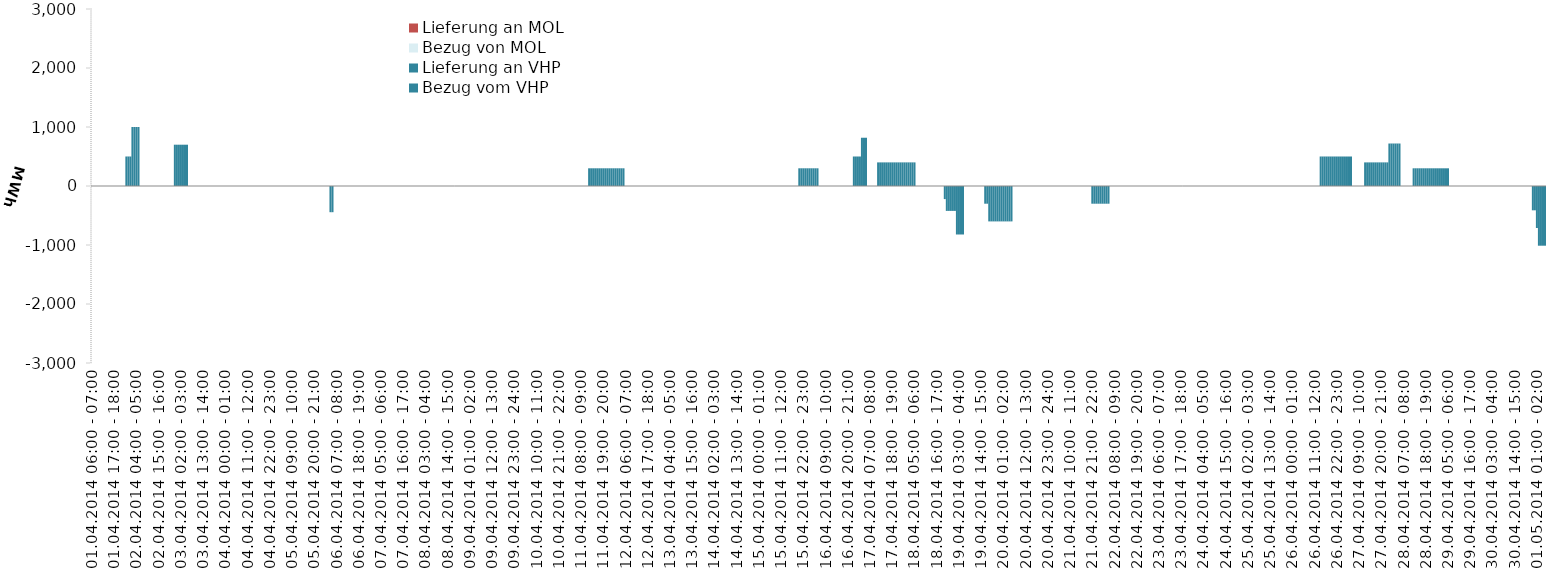
| Category | Bezug vom VHP | Lieferung an VHP | Bezug von MOL | Lieferung an MOL |
|---|---|---|---|---|
| 01.04.2014 06:00 - 07:00 | 0 | 0 | 0 | 0 |
| 01.04.2014 07:00 - 08:00 | 0 | 0 | 0 | 0 |
| 01.04.2014 08:00 - 09:00 | 0 | 0 | 0 | 0 |
| 01.04.2014 09:00 - 10:00 | 0 | 0 | 0 | 0 |
| 01.04.2014 10:00 - 11:00 | 0 | 0 | 0 | 0 |
| 01.04.2014 11:00 - 12:00 | 0 | 0 | 0 | 0 |
| 01.04.2014 12:00 - 13:00 | 0 | 0 | 0 | 0 |
| 01.04.2014 13:00 - 14:00 | 0 | 0 | 0 | 0 |
| 01.04.2014 14:00 - 15:00 | 0 | 0 | 0 | 0 |
| 01.04.2014 15:00 - 16:00 | 0 | 0 | 0 | 0 |
| 01.04.2014 16:00 - 17:00 | 0 | 0 | 0 | 0 |
| 01.04.2014 17:00 - 18:00 | 0 | 0 | 0 | 0 |
| 01.04.2014 18:00 - 19:00 | 0 | 0 | 0 | 0 |
| 01.04.2014 19:00 - 20:00 | 0 | 0 | 0 | 0 |
| 01.04.2014 20:00 - 21:00 | 0 | 0 | 0 | 0 |
| 01.04.2014 21:00 - 22:00 | 0 | 0 | 0 | 0 |
| 01.04.2014 22:00 - 23:00 | 0 | 0 | 0 | 0 |
| 01.04.2014 23:00 - 24:00 | 500 | 0 | 0 | 0 |
| 02.04.2014 00:00 - 01:00 | 500 | 0 | 0 | 0 |
| 02.04.2014 01:00 - 02:00 | 500 | 0 | 0 | 0 |
| 02.04.2014 02:00 - 03:00 | 1000 | 0 | 0 | 0 |
| 02.04.2014 03:00 - 04:00 | 1000 | 0 | 0 | 0 |
| 02.04.2014 04:00 - 05:00 | 1000 | 0 | 0 | 0 |
| 02.04.2014 05:00 - 06:00 | 1000 | 0 | 0 | 0 |
| 02.04.2014 06:00 - 07:00 | 0 | 0 | 0 | 0 |
| 02.04.2014 07:00 - 08:00 | 0 | 0 | 0 | 0 |
| 02.04.2014 08:00 - 09:00 | 0 | 0 | 0 | 0 |
| 02.04.2014 09:00 - 10:00 | 0 | 0 | 0 | 0 |
| 02.04.2014 10:00 - 11:00 | 0 | 0 | 0 | 0 |
| 02.04.2014 11:00 - 12:00 | 0 | 0 | 0 | 0 |
| 02.04.2014 12:00 - 13:00 | 0 | 0 | 0 | 0 |
| 02.04.2014 13:00 - 14:00 | 0 | 0 | 0 | 0 |
| 02.04.2014 14:00 - 15:00 | 0 | 0 | 0 | 0 |
| 02.04.2014 15:00 - 16:00 | 0 | 0 | 0 | 0 |
| 02.04.2014 16:00 - 17:00 | 0 | 0 | 0 | 0 |
| 02.04.2014 17:00 - 18:00 | 0 | 0 | 0 | 0 |
| 02.04.2014 18:00 - 19:00 | 0 | 0 | 0 | 0 |
| 02.04.2014 19:00 - 20:00 | 0 | 0 | 0 | 0 |
| 02.04.2014 20:00 - 21:00 | 0 | 0 | 0 | 0 |
| 02.04.2014 21:00 - 22:00 | 0 | 0 | 0 | 0 |
| 02.04.2014 22:00 - 23:00 | 0 | 0 | 0 | 0 |
| 02.04.2014 23:00 - 24:00 | 700 | 0 | 0 | 0 |
| 03.04.2014 00:00 - 01:00 | 700 | 0 | 0 | 0 |
| 03.04.2014 01:00 - 02:00 | 700 | 0 | 0 | 0 |
| 03.04.2014 02:00 - 03:00 | 700 | 0 | 0 | 0 |
| 03.04.2014 03:00 - 04:00 | 700 | 0 | 0 | 0 |
| 03.04.2014 04:00 - 05:00 | 700 | 0 | 0 | 0 |
| 03.04.2014 05:00 - 06:00 | 700 | 0 | 0 | 0 |
| 03.04.2014 06:00 - 07:00 | 0 | 0 | 0 | 0 |
| 03.04.2014 07:00 - 08:00 | 0 | 0 | 0 | 0 |
| 03.04.2014 08:00 - 09:00 | 0 | 0 | 0 | 0 |
| 03.04.2014 09:00 - 10:00 | 0 | 0 | 0 | 0 |
| 03.04.2014 10:00 - 11:00 | 0 | 0 | 0 | 0 |
| 03.04.2014 11:00 - 12:00 | 0 | 0 | 0 | 0 |
| 03.04.2014 12:00 - 13:00 | 0 | 0 | 0 | 0 |
| 03.04.2014 13:00 - 14:00 | 0 | 0 | 0 | 0 |
| 03.04.2014 14:00 - 15:00 | 0 | 0 | 0 | 0 |
| 03.04.2014 15:00 - 16:00 | 0 | 0 | 0 | 0 |
| 03.04.2014 16:00 - 17:00 | 0 | 0 | 0 | 0 |
| 03.04.2014 17:00 - 18:00 | 0 | 0 | 0 | 0 |
| 03.04.2014 18:00 - 19:00 | 0 | 0 | 0 | 0 |
| 03.04.2014 19:00 - 20:00 | 0 | 0 | 0 | 0 |
| 03.04.2014 20:00 - 21:00 | 0 | 0 | 0 | 0 |
| 03.04.2014 21:00 - 22:00 | 0 | 0 | 0 | 0 |
| 03.04.2014 22:00 - 23:00 | 0 | 0 | 0 | 0 |
| 03.04.2014 23:00 - 24:00 | 0 | 0 | 0 | 0 |
| 04.04.2014 00:00 - 01:00 | 0 | 0 | 0 | 0 |
| 04.04.2014 01:00 - 02:00 | 0 | 0 | 0 | 0 |
| 04.04.2014 02:00 - 03:00 | 0 | 0 | 0 | 0 |
| 04.04.2014 03:00 - 04:00 | 0 | 0 | 0 | 0 |
| 04.04.2014 04:00 - 05:00 | 0 | 0 | 0 | 0 |
| 04.04.2014 05:00 - 06:00 | 0 | 0 | 0 | 0 |
| 04.04.2014 06:00 - 07:00 | 0 | 0 | 0 | 0 |
| 04.04.2014 07:00 - 08:00 | 0 | 0 | 0 | 0 |
| 04.04.2014 08:00 - 09:00 | 0 | 0 | 0 | 0 |
| 04.04.2014 09:00 - 10:00 | 0 | 0 | 0 | 0 |
| 04.04.2014 10:00 - 11:00 | 0 | 0 | 0 | 0 |
| 04.04.2014 11:00 - 12:00 | 0 | 0 | 0 | 0 |
| 04.04.2014 12:00 - 13:00 | 0 | 0 | 0 | 0 |
| 04.04.2014 13:00 - 14:00 | 0 | 0 | 0 | 0 |
| 04.04.2014 14:00 - 15:00 | 0 | 0 | 0 | 0 |
| 04.04.2014 15:00 - 16:00 | 0 | 0 | 0 | 0 |
| 04.04.2014 16:00 - 17:00 | 0 | 0 | 0 | 0 |
| 04.04.2014 17:00 - 18:00 | 0 | 0 | 0 | 0 |
| 04.04.2014 18:00 - 19:00 | 0 | 0 | 0 | 0 |
| 04.04.2014 19:00 - 20:00 | 0 | 0 | 0 | 0 |
| 04.04.2014 20:00 - 21:00 | 0 | 0 | 0 | 0 |
| 04.04.2014 21:00 - 22:00 | 0 | 0 | 0 | 0 |
| 04.04.2014 22:00 - 23:00 | 0 | 0 | 0 | 0 |
| 04.04.2014 23:00 - 24:00 | 0 | 0 | 0 | 0 |
| 05.04.2014 00:00 - 01:00 | 0 | 0 | 0 | 0 |
| 05.04.2014 01:00 - 02:00 | 0 | 0 | 0 | 0 |
| 05.04.2014 02:00 - 03:00 | 0 | 0 | 0 | 0 |
| 05.04.2014 03:00 - 04:00 | 0 | 0 | 0 | 0 |
| 05.04.2014 04:00 - 05:00 | 0 | 0 | 0 | 0 |
| 05.04.2014 05:00 - 06:00 | 0 | 0 | 0 | 0 |
| 05.04.2014 06:00 - 07:00 | 0 | 0 | 0 | 0 |
| 05.04.2014 07:00 - 08:00 | 0 | 0 | 0 | 0 |
| 05.04.2014 08:00 - 09:00 | 0 | 0 | 0 | 0 |
| 05.04.2014 09:00 - 10:00 | 0 | 0 | 0 | 0 |
| 05.04.2014 10:00 - 11:00 | 0 | 0 | 0 | 0 |
| 05.04.2014 11:00 - 12:00 | 0 | 0 | 0 | 0 |
| 05.04.2014 12:00 - 13:00 | 0 | 0 | 0 | 0 |
| 05.04.2014 13:00 - 14:00 | 0 | 0 | 0 | 0 |
| 05.04.2014 14:00 - 15:00 | 0 | 0 | 0 | 0 |
| 05.04.2014 15:00 - 16:00 | 0 | 0 | 0 | 0 |
| 05.04.2014 16:00 - 17:00 | 0 | 0 | 0 | 0 |
| 05.04.2014 17:00 - 18:00 | 0 | 0 | 0 | 0 |
| 05.04.2014 18:00 - 19:00 | 0 | 0 | 0 | 0 |
| 05.04.2014 19:00 - 20:00 | 0 | 0 | 0 | 0 |
| 05.04.2014 20:00 - 21:00 | 0 | 0 | 0 | 0 |
| 05.04.2014 21:00 - 22:00 | 0 | 0 | 0 | 0 |
| 05.04.2014 22:00 - 23:00 | 0 | 0 | 0 | 0 |
| 05.04.2014 23:00 - 24:00 | 0 | 0 | 0 | 0 |
| 06.04.2014 00:00 - 01:00 | 0 | 0 | 0 | 0 |
| 06.04.2014 01:00 - 02:00 | 0 | 0 | 0 | 0 |
| 06.04.2014 02:00 - 03:00 | 0 | 0 | 0 | 0 |
| 06.04.2014 03:00 - 04:00 | 0 | 0 | 0 | 0 |
| 06.04.2014 04:00 - 05:00 | 0 | -444 | 0 | 0 |
| 06.04.2014 05:00 - 06:00 | 0 | -444 | 0 | 0 |
| 06.04.2014 06:00 - 07:00 | 0 | 0 | 0 | 0 |
| 06.04.2014 07:00 - 08:00 | 0 | 0 | 0 | 0 |
| 06.04.2014 08:00 - 09:00 | 0 | 0 | 0 | 0 |
| 06.04.2014 09:00 - 10:00 | 0 | 0 | 0 | 0 |
| 06.04.2014 10:00 - 11:00 | 0 | 0 | 0 | 0 |
| 06.04.2014 11:00 - 12:00 | 0 | 0 | 0 | 0 |
| 06.04.2014 12:00 - 13:00 | 0 | 0 | 0 | 0 |
| 06.04.2014 13:00 - 14:00 | 0 | 0 | 0 | 0 |
| 06.04.2014 14:00 - 15:00 | 0 | 0 | 0 | 0 |
| 06.04.2014 15:00 - 16:00 | 0 | 0 | 0 | 0 |
| 06.04.2014 16:00 - 17:00 | 0 | 0 | 0 | 0 |
| 06.04.2014 17:00 - 18:00 | 0 | 0 | 0 | 0 |
| 06.04.2014 18:00 - 19:00 | 0 | 0 | 0 | 0 |
| 06.04.2014 19:00 - 20:00 | 0 | 0 | 0 | 0 |
| 06.04.2014 20:00 - 21:00 | 0 | 0 | 0 | 0 |
| 06.04.2014 21:00 - 22:00 | 0 | 0 | 0 | 0 |
| 06.04.2014 22:00 - 23:00 | 0 | 0 | 0 | 0 |
| 06.04.2014 23:00 - 24:00 | 0 | 0 | 0 | 0 |
| 07.04.2014 00:00 - 01:00 | 0 | 0 | 0 | 0 |
| 07.04.2014 01:00 - 02:00 | 0 | 0 | 0 | 0 |
| 07.04.2014 02:00 - 03:00 | 0 | 0 | 0 | 0 |
| 07.04.2014 03:00 - 04:00 | 0 | 0 | 0 | 0 |
| 07.04.2014 04:00 - 05:00 | 0 | 0 | 0 | 0 |
| 07.04.2014 05:00 - 06:00 | 0 | 0 | 0 | 0 |
| 07.04.2014 06:00 - 07:00 | 0 | 0 | 0 | 0 |
| 07.04.2014 07:00 - 08:00 | 0 | 0 | 0 | 0 |
| 07.04.2014 08:00 - 09:00 | 0 | 0 | 0 | 0 |
| 07.04.2014 09:00 - 10:00 | 0 | 0 | 0 | 0 |
| 07.04.2014 10:00 - 11:00 | 0 | 0 | 0 | 0 |
| 07.04.2014 11:00 - 12:00 | 0 | 0 | 0 | 0 |
| 07.04.2014 12:00 - 13:00 | 0 | 0 | 0 | 0 |
| 07.04.2014 13:00 - 14:00 | 0 | 0 | 0 | 0 |
| 07.04.2014 14:00 - 15:00 | 0 | 0 | 0 | 0 |
| 07.04.2014 15:00 - 16:00 | 0 | 0 | 0 | 0 |
| 07.04.2014 16:00 - 17:00 | 0 | 0 | 0 | 0 |
| 07.04.2014 17:00 - 18:00 | 0 | 0 | 0 | 0 |
| 07.04.2014 18:00 - 19:00 | 0 | 0 | 0 | 0 |
| 07.04.2014 19:00 - 20:00 | 0 | 0 | 0 | 0 |
| 07.04.2014 20:00 - 21:00 | 0 | 0 | 0 | 0 |
| 07.04.2014 21:00 - 22:00 | 0 | 0 | 0 | 0 |
| 07.04.2014 22:00 - 23:00 | 0 | 0 | 0 | 0 |
| 07.04.2014 23:00 - 24:00 | 0 | 0 | 0 | 0 |
| 08.04.2014 00:00 - 01:00 | 0 | 0 | 0 | 0 |
| 08.04.2014 01:00 - 02:00 | 0 | 0 | 0 | 0 |
| 08.04.2014 02:00 - 03:00 | 0 | 0 | 0 | 0 |
| 08.04.2014 03:00 - 04:00 | 0 | 0 | 0 | 0 |
| 08.04.2014 04:00 - 05:00 | 0 | 0 | 0 | 0 |
| 08.04.2014 05:00 - 06:00 | 0 | 0 | 0 | 0 |
| 08.04.2014 06:00 - 07:00 | 0 | 0 | 0 | 0 |
| 08.04.2014 07:00 - 08:00 | 0 | 0 | 0 | 0 |
| 08.04.2014 08:00 - 09:00 | 0 | 0 | 0 | 0 |
| 08.04.2014 09:00 - 10:00 | 0 | 0 | 0 | 0 |
| 08.04.2014 10:00 - 11:00 | 0 | 0 | 0 | 0 |
| 08.04.2014 11:00 - 12:00 | 0 | 0 | 0 | 0 |
| 08.04.2014 12:00 - 13:00 | 0 | 0 | 0 | 0 |
| 08.04.2014 13:00 - 14:00 | 0 | 0 | 0 | 0 |
| 08.04.2014 14:00 - 15:00 | 0 | 0 | 0 | 0 |
| 08.04.2014 15:00 - 16:00 | 0 | 0 | 0 | 0 |
| 08.04.2014 16:00 - 17:00 | 0 | 0 | 0 | 0 |
| 08.04.2014 17:00 - 18:00 | 0 | 0 | 0 | 0 |
| 08.04.2014 18:00 - 19:00 | 0 | 0 | 0 | 0 |
| 08.04.2014 19:00 - 20:00 | 0 | 0 | 0 | 0 |
| 08.04.2014 20:00 - 21:00 | 0 | 0 | 0 | 0 |
| 08.04.2014 21:00 - 22:00 | 0 | 0 | 0 | 0 |
| 08.04.2014 22:00 - 23:00 | 0 | 0 | 0 | 0 |
| 08.04.2014 23:00 - 24:00 | 0 | 0 | 0 | 0 |
| 09.04.2014 00:00 - 01:00 | 0 | 0 | 0 | 0 |
| 09.04.2014 01:00 - 02:00 | 0 | 0 | 0 | 0 |
| 09.04.2014 02:00 - 03:00 | 0 | 0 | 0 | 0 |
| 09.04.2014 03:00 - 04:00 | 0 | 0 | 0 | 0 |
| 09.04.2014 04:00 - 05:00 | 0 | 0 | 0 | 0 |
| 09.04.2014 05:00 - 06:00 | 0 | 0 | 0 | 0 |
| 09.04.2014 06:00 - 07:00 | 0 | 0 | 0 | 0 |
| 09.04.2014 07:00 - 08:00 | 0 | 0 | 0 | 0 |
| 09.04.2014 08:00 - 09:00 | 0 | 0 | 0 | 0 |
| 09.04.2014 09:00 - 10:00 | 0 | 0 | 0 | 0 |
| 09.04.2014 10:00 - 11:00 | 0 | 0 | 0 | 0 |
| 09.04.2014 11:00 - 12:00 | 0 | 0 | 0 | 0 |
| 09.04.2014 12:00 - 13:00 | 0 | 0 | 0 | 0 |
| 09.04.2014 13:00 - 14:00 | 0 | 0 | 0 | 0 |
| 09.04.2014 14:00 - 15:00 | 0 | 0 | 0 | 0 |
| 09.04.2014 15:00 - 16:00 | 0 | 0 | 0 | 0 |
| 09.04.2014 16:00 - 17:00 | 0 | 0 | 0 | 0 |
| 09.04.2014 17:00 - 18:00 | 0 | 0 | 0 | 0 |
| 09.04.2014 18:00 - 19:00 | 0 | 0 | 0 | 0 |
| 09.04.2014 19:00 - 20:00 | 0 | 0 | 0 | 0 |
| 09.04.2014 20:00 - 21:00 | 0 | 0 | 0 | 0 |
| 09.04.2014 21:00 - 22:00 | 0 | 0 | 0 | 0 |
| 09.04.2014 22:00 - 23:00 | 0 | 0 | 0 | 0 |
| 09.04.2014 23:00 - 24:00 | 0 | 0 | 0 | 0 |
| 10.04.2014 00:00 - 01:00 | 0 | 0 | 0 | 0 |
| 10.04.2014 01:00 - 02:00 | 0 | 0 | 0 | 0 |
| 10.04.2014 02:00 - 03:00 | 0 | 0 | 0 | 0 |
| 10.04.2014 03:00 - 04:00 | 0 | 0 | 0 | 0 |
| 10.04.2014 04:00 - 05:00 | 0 | 0 | 0 | 0 |
| 10.04.2014 05:00 - 06:00 | 0 | 0 | 0 | 0 |
| 10.04.2014 06:00 - 07:00 | 0 | 0 | 0 | 0 |
| 10.04.2014 07:00 - 08:00 | 0 | 0 | 0 | 0 |
| 10.04.2014 08:00 - 09:00 | 0 | 0 | 0 | 0 |
| 10.04.2014 09:00 - 10:00 | 0 | 0 | 0 | 0 |
| 10.04.2014 10:00 - 11:00 | 0 | 0 | 0 | 0 |
| 10.04.2014 11:00 - 12:00 | 0 | 0 | 0 | 0 |
| 10.04.2014 12:00 - 13:00 | 0 | 0 | 0 | 0 |
| 10.04.2014 13:00 - 14:00 | 0 | 0 | 0 | 0 |
| 10.04.2014 14:00 - 15:00 | 0 | 0 | 0 | 0 |
| 10.04.2014 15:00 - 16:00 | 0 | 0 | 0 | 0 |
| 10.04.2014 16:00 - 17:00 | 0 | 0 | 0 | 0 |
| 10.04.2014 17:00 - 18:00 | 0 | 0 | 0 | 0 |
| 10.04.2014 18:00 - 19:00 | 0 | 0 | 0 | 0 |
| 10.04.2014 19:00 - 20:00 | 0 | 0 | 0 | 0 |
| 10.04.2014 20:00 - 21:00 | 0 | 0 | 0 | 0 |
| 10.04.2014 21:00 - 22:00 | 0 | 0 | 0 | 0 |
| 10.04.2014 22:00 - 23:00 | 0 | 0 | 0 | 0 |
| 10.04.2014 23:00 - 24:00 | 0 | 0 | 0 | 0 |
| 11.04.2014 00:00 - 01:00 | 0 | 0 | 0 | 0 |
| 11.04.2014 01:00 - 02:00 | 0 | 0 | 0 | 0 |
| 11.04.2014 02:00 - 03:00 | 0 | 0 | 0 | 0 |
| 11.04.2014 03:00 - 04:00 | 0 | 0 | 0 | 0 |
| 11.04.2014 04:00 - 05:00 | 0 | 0 | 0 | 0 |
| 11.04.2014 05:00 - 06:00 | 0 | 0 | 0 | 0 |
| 11.04.2014 06:00 - 07:00 | 0 | 0 | 0 | 0 |
| 11.04.2014 07:00 - 08:00 | 0 | 0 | 0 | 0 |
| 11.04.2014 08:00 - 09:00 | 0 | 0 | 0 | 0 |
| 11.04.2014 09:00 - 10:00 | 0 | 0 | 0 | 0 |
| 11.04.2014 10:00 - 11:00 | 0 | 0 | 0 | 0 |
| 11.04.2014 11:00 - 12:00 | 0 | 0 | 0 | 0 |
| 11.04.2014 12:00 - 13:00 | 300 | 0 | 0 | 0 |
| 11.04.2014 13:00 - 14:00 | 300 | 0 | 0 | 0 |
| 11.04.2014 14:00 - 15:00 | 300 | 0 | 0 | 0 |
| 11.04.2014 15:00 - 16:00 | 300 | 0 | 0 | 0 |
| 11.04.2014 16:00 - 17:00 | 300 | 0 | 0 | 0 |
| 11.04.2014 17:00 - 18:00 | 300 | 0 | 0 | 0 |
| 11.04.2014 18:00 - 19:00 | 300 | 0 | 0 | 0 |
| 11.04.2014 19:00 - 20:00 | 300 | 0 | 0 | 0 |
| 11.04.2014 20:00 - 21:00 | 300 | 0 | 0 | 0 |
| 11.04.2014 21:00 - 22:00 | 300 | 0 | 0 | 0 |
| 11.04.2014 22:00 - 23:00 | 300 | 0 | 0 | 0 |
| 11.04.2014 23:00 - 24:00 | 300 | 0 | 0 | 0 |
| 12.04.2014 00:00 - 01:00 | 300 | 0 | 0 | 0 |
| 12.04.2014 01:00 - 02:00 | 300 | 0 | 0 | 0 |
| 12.04.2014 02:00 - 03:00 | 300 | 0 | 0 | 0 |
| 12.04.2014 03:00 - 04:00 | 300 | 0 | 0 | 0 |
| 12.04.2014 04:00 - 05:00 | 300 | 0 | 0 | 0 |
| 12.04.2014 05:00 - 06:00 | 300 | 0 | 0 | 0 |
| 12.04.2014 06:00 - 07:00 | 0 | 0 | 0 | 0 |
| 12.04.2014 07:00 - 08:00 | 0 | 0 | 0 | 0 |
| 12.04.2014 08:00 - 09:00 | 0 | 0 | 0 | 0 |
| 12.04.2014 09:00 - 10:00 | 0 | 0 | 0 | 0 |
| 12.04.2014 10:00 - 11:00 | 0 | 0 | 0 | 0 |
| 12.04.2014 11:00 - 12:00 | 0 | 0 | 0 | 0 |
| 12.04.2014 12:00 - 13:00 | 0 | 0 | 0 | 0 |
| 12.04.2014 13:00 - 14:00 | 0 | 0 | 0 | 0 |
| 12.04.2014 14:00 - 15:00 | 0 | 0 | 0 | 0 |
| 12.04.2014 15:00 - 16:00 | 0 | 0 | 0 | 0 |
| 12.04.2014 16:00 - 17:00 | 0 | 0 | 0 | 0 |
| 12.04.2014 17:00 - 18:00 | 0 | 0 | 0 | 0 |
| 12.04.2014 18:00 - 19:00 | 0 | 0 | 0 | 0 |
| 12.04.2014 19:00 - 20:00 | 0 | 0 | 0 | 0 |
| 12.04.2014 20:00 - 21:00 | 0 | 0 | 0 | 0 |
| 12.04.2014 21:00 - 22:00 | 0 | 0 | 0 | 0 |
| 12.04.2014 22:00 - 23:00 | 0 | 0 | 0 | 0 |
| 12.04.2014 23:00 - 24:00 | 0 | 0 | 0 | 0 |
| 13.04.2014 00:00 - 01:00 | 0 | 0 | 0 | 0 |
| 13.04.2014 01:00 - 02:00 | 0 | 0 | 0 | 0 |
| 13.04.2014 02:00 - 03:00 | 0 | 0 | 0 | 0 |
| 13.04.2014 03:00 - 04:00 | 0 | 0 | 0 | 0 |
| 13.04.2014 04:00 - 05:00 | 0 | 0 | 0 | 0 |
| 13.04.2014 05:00 - 06:00 | 0 | 0 | 0 | 0 |
| 13.04.2014 06:00 - 07:00 | 0 | 0 | 0 | 0 |
| 13.04.2014 07:00 - 08:00 | 0 | 0 | 0 | 0 |
| 13.04.2014 08:00 - 09:00 | 0 | 0 | 0 | 0 |
| 13.04.2014 09:00 - 10:00 | 0 | 0 | 0 | 0 |
| 13.04.2014 10:00 - 11:00 | 0 | 0 | 0 | 0 |
| 13.04.2014 11:00 - 12:00 | 0 | 0 | 0 | 0 |
| 13.04.2014 12:00 - 13:00 | 0 | 0 | 0 | 0 |
| 13.04.2014 13:00 - 14:00 | 0 | 0 | 0 | 0 |
| 13.04.2014 14:00 - 15:00 | 0 | 0 | 0 | 0 |
| 13.04.2014 15:00 - 16:00 | 0 | 0 | 0 | 0 |
| 13.04.2014 16:00 - 17:00 | 0 | 0 | 0 | 0 |
| 13.04.2014 17:00 - 18:00 | 0 | 0 | 0 | 0 |
| 13.04.2014 18:00 - 19:00 | 0 | 0 | 0 | 0 |
| 13.04.2014 19:00 - 20:00 | 0 | 0 | 0 | 0 |
| 13.04.2014 20:00 - 21:00 | 0 | 0 | 0 | 0 |
| 13.04.2014 21:00 - 22:00 | 0 | 0 | 0 | 0 |
| 13.04.2014 22:00 - 23:00 | 0 | 0 | 0 | 0 |
| 13.04.2014 23:00 - 24:00 | 0 | 0 | 0 | 0 |
| 14.04.2014 00:00 - 01:00 | 0 | 0 | 0 | 0 |
| 14.04.2014 01:00 - 02:00 | 0 | 0 | 0 | 0 |
| 14.04.2014 02:00 - 03:00 | 0 | 0 | 0 | 0 |
| 14.04.2014 03:00 - 04:00 | 0 | 0 | 0 | 0 |
| 14.04.2014 04:00 - 05:00 | 0 | 0 | 0 | 0 |
| 14.04.2014 05:00 - 06:00 | 0 | 0 | 0 | 0 |
| 14.04.2014 06:00 - 07:00 | 0 | 0 | 0 | 0 |
| 14.04.2014 07:00 - 08:00 | 0 | 0 | 0 | 0 |
| 14.04.2014 08:00 - 09:00 | 0 | 0 | 0 | 0 |
| 14.04.2014 09:00 - 10:00 | 0 | 0 | 0 | 0 |
| 14.04.2014 10:00 - 11:00 | 0 | 0 | 0 | 0 |
| 14.04.2014 11:00 - 12:00 | 0 | 0 | 0 | 0 |
| 14.04.2014 12:00 - 13:00 | 0 | 0 | 0 | 0 |
| 14.04.2014 13:00 - 14:00 | 0 | 0 | 0 | 0 |
| 14.04.2014 14:00 - 15:00 | 0 | 0 | 0 | 0 |
| 14.04.2014 15:00 - 16:00 | 0 | 0 | 0 | 0 |
| 14.04.2014 16:00 - 17:00 | 0 | 0 | 0 | 0 |
| 14.04.2014 17:00 - 18:00 | 0 | 0 | 0 | 0 |
| 14.04.2014 18:00 - 19:00 | 0 | 0 | 0 | 0 |
| 14.04.2014 19:00 - 20:00 | 0 | 0 | 0 | 0 |
| 14.04.2014 20:00 - 21:00 | 0 | 0 | 0 | 0 |
| 14.04.2014 21:00 - 22:00 | 0 | 0 | 0 | 0 |
| 14.04.2014 22:00 - 23:00 | 0 | 0 | 0 | 0 |
| 14.04.2014 23:00 - 24:00 | 0 | 0 | 0 | 0 |
| 15.04.2014 00:00 - 01:00 | 0 | 0 | 0 | 0 |
| 15.04.2014 01:00 - 02:00 | 0 | 0 | 0 | 0 |
| 15.04.2014 02:00 - 03:00 | 0 | 0 | 0 | 0 |
| 15.04.2014 03:00 - 04:00 | 0 | 0 | 0 | 0 |
| 15.04.2014 04:00 - 05:00 | 0 | 0 | 0 | 0 |
| 15.04.2014 05:00 - 06:00 | 0 | 0 | 0 | 0 |
| 15.04.2014 06:00 - 07:00 | 0 | 0 | 0 | 0 |
| 15.04.2014 07:00 - 08:00 | 0 | 0 | 0 | 0 |
| 15.04.2014 08:00 - 09:00 | 0 | 0 | 0 | 0 |
| 15.04.2014 09:00 - 10:00 | 0 | 0 | 0 | 0 |
| 15.04.2014 10:00 - 11:00 | 0 | 0 | 0 | 0 |
| 15.04.2014 11:00 - 12:00 | 0 | 0 | 0 | 0 |
| 15.04.2014 12:00 - 13:00 | 0 | 0 | 0 | 0 |
| 15.04.2014 13:00 - 14:00 | 0 | 0 | 0 | 0 |
| 15.04.2014 14:00 - 15:00 | 0 | 0 | 0 | 0 |
| 15.04.2014 15:00 - 16:00 | 0 | 0 | 0 | 0 |
| 15.04.2014 16:00 - 17:00 | 0 | 0 | 0 | 0 |
| 15.04.2014 17:00 - 18:00 | 0 | 0 | 0 | 0 |
| 15.04.2014 18:00 - 19:00 | 0 | 0 | 0 | 0 |
| 15.04.2014 19:00 - 20:00 | 0 | 0 | 0 | 0 |
| 15.04.2014 20:00 - 21:00 | 300 | 0 | 0 | 0 |
| 15.04.2014 21:00 - 22:00 | 300 | 0 | 0 | 0 |
| 15.04.2014 22:00 - 23:00 | 300 | 0 | 0 | 0 |
| 15.04.2014 23:00 - 24:00 | 300 | 0 | 0 | 0 |
| 16.04.2014 00:00 - 01:00 | 300 | 0 | 0 | 0 |
| 16.04.2014 01:00 - 02:00 | 300 | 0 | 0 | 0 |
| 16.04.2014 02:00 - 03:00 | 300 | 0 | 0 | 0 |
| 16.04.2014 03:00 - 04:00 | 300 | 0 | 0 | 0 |
| 16.04.2014 04:00 - 05:00 | 300 | 0 | 0 | 0 |
| 16.04.2014 05:00 - 06:00 | 300 | 0 | 0 | 0 |
| 16.04.2014 06:00 - 07:00 | 0 | 0 | 0 | 0 |
| 16.04.2014 07:00 - 08:00 | 0 | 0 | 0 | 0 |
| 16.04.2014 08:00 - 09:00 | 0 | 0 | 0 | 0 |
| 16.04.2014 09:00 - 10:00 | 0 | 0 | 0 | 0 |
| 16.04.2014 10:00 - 11:00 | 0 | 0 | 0 | 0 |
| 16.04.2014 11:00 - 12:00 | 0 | 0 | 0 | 0 |
| 16.04.2014 12:00 - 13:00 | 0 | 0 | 0 | 0 |
| 16.04.2014 13:00 - 14:00 | 0 | 0 | 0 | 0 |
| 16.04.2014 14:00 - 15:00 | 0 | 0 | 0 | 0 |
| 16.04.2014 15:00 - 16:00 | 0 | 0 | 0 | 0 |
| 16.04.2014 16:00 - 17:00 | 0 | 0 | 0 | 0 |
| 16.04.2014 17:00 - 18:00 | 0 | 0 | 0 | 0 |
| 16.04.2014 18:00 - 19:00 | 0 | 0 | 0 | 0 |
| 16.04.2014 19:00 - 20:00 | 0 | 0 | 0 | 0 |
| 16.04.2014 20:00 - 21:00 | 0 | 0 | 0 | 0 |
| 16.04.2014 21:00 - 22:00 | 0 | 0 | 0 | 0 |
| 16.04.2014 22:00 - 23:00 | 0 | 0 | 0 | 0 |
| 16.04.2014 23:00 - 24:00 | 500 | 0 | 0 | 0 |
| 17.04.2014 00:00 - 01:00 | 500 | 0 | 0 | 0 |
| 17.04.2014 01:00 - 02:00 | 500 | 0 | 0 | 0 |
| 17.04.2014 02:00 - 03:00 | 500 | 0 | 0 | 0 |
| 17.04.2014 03:00 - 04:00 | 818 | 0 | 0 | 0 |
| 17.04.2014 04:00 - 05:00 | 818 | 0 | 0 | 0 |
| 17.04.2014 05:00 - 06:00 | 818 | 0 | 0 | 0 |
| 17.04.2014 06:00 - 07:00 | 0 | 0 | 0 | 0 |
| 17.04.2014 07:00 - 08:00 | 0 | 0 | 0 | 0 |
| 17.04.2014 08:00 - 09:00 | 0 | 0 | 0 | 0 |
| 17.04.2014 09:00 - 10:00 | 0 | 0 | 0 | 0 |
| 17.04.2014 10:00 - 11:00 | 0 | 0 | 0 | 0 |
| 17.04.2014 11:00 - 12:00 | 400 | 0 | 0 | 0 |
| 17.04.2014 12:00 - 13:00 | 400 | 0 | 0 | 0 |
| 17.04.2014 13:00 - 14:00 | 400 | 0 | 0 | 0 |
| 17.04.2014 14:00 - 15:00 | 400 | 0 | 0 | 0 |
| 17.04.2014 15:00 - 16:00 | 400 | 0 | 0 | 0 |
| 17.04.2014 16:00 - 17:00 | 400 | 0 | 0 | 0 |
| 17.04.2014 17:00 - 18:00 | 400 | 0 | 0 | 0 |
| 17.04.2014 18:00 - 19:00 | 400 | 0 | 0 | 0 |
| 17.04.2014 19:00 - 20:00 | 400 | 0 | 0 | 0 |
| 17.04.2014 20:00 - 21:00 | 400 | 0 | 0 | 0 |
| 17.04.2014 21:00 - 22:00 | 400 | 0 | 0 | 0 |
| 17.04.2014 22:00 - 23:00 | 400 | 0 | 0 | 0 |
| 17.04.2014 23:00 - 24:00 | 400 | 0 | 0 | 0 |
| 18.04.2014 00:00 - 01:00 | 400 | 0 | 0 | 0 |
| 18.04.2014 01:00 - 02:00 | 400 | 0 | 0 | 0 |
| 18.04.2014 02:00 - 03:00 | 400 | 0 | 0 | 0 |
| 18.04.2014 03:00 - 04:00 | 400 | 0 | 0 | 0 |
| 18.04.2014 04:00 - 05:00 | 400 | 0 | 0 | 0 |
| 18.04.2014 05:00 - 06:00 | 400 | 0 | 0 | 0 |
| 18.04.2014 06:00 - 07:00 | 0 | 0 | 0 | 0 |
| 18.04.2014 07:00 - 08:00 | 0 | 0 | 0 | 0 |
| 18.04.2014 08:00 - 09:00 | 0 | 0 | 0 | 0 |
| 18.04.2014 09:00 - 10:00 | 0 | 0 | 0 | 0 |
| 18.04.2014 10:00 - 11:00 | 0 | 0 | 0 | 0 |
| 18.04.2014 11:00 - 12:00 | 0 | 0 | 0 | 0 |
| 18.04.2014 12:00 - 13:00 | 0 | 0 | 0 | 0 |
| 18.04.2014 13:00 - 14:00 | 0 | 0 | 0 | 0 |
| 18.04.2014 14:00 - 15:00 | 0 | 0 | 0 | 0 |
| 18.04.2014 15:00 - 16:00 | 0 | 0 | 0 | 0 |
| 18.04.2014 16:00 - 17:00 | 0 | 0 | 0 | 0 |
| 18.04.2014 17:00 - 18:00 | 0 | 0 | 0 | 0 |
| 18.04.2014 18:00 - 19:00 | 0 | 0 | 0 | 0 |
| 18.04.2014 19:00 - 20:00 | 0 | 0 | 0 | 0 |
| 18.04.2014 20:00 - 21:00 | 0 | -222 | 0 | 0 |
| 18.04.2014 21:00 - 22:00 | 0 | -422 | 0 | 0 |
| 18.04.2014 22:00 - 23:00 | 0 | -422 | 0 | 0 |
| 18.04.2014 23:00 - 24:00 | 0 | -422 | 0 | 0 |
| 19.04.2014 00:00 - 01:00 | 0 | -422 | 0 | 0 |
| 19.04.2014 01:00 - 02:00 | 0 | -422 | 0 | 0 |
| 19.04.2014 02:00 - 03:00 | 0 | -822 | 0 | 0 |
| 19.04.2014 03:00 - 04:00 | 0 | -822 | 0 | 0 |
| 19.04.2014 04:00 - 05:00 | 0 | -822 | 0 | 0 |
| 19.04.2014 05:00 - 06:00 | 0 | -822 | 0 | 0 |
| 19.04.2014 06:00 - 07:00 | 0 | 0 | 0 | 0 |
| 19.04.2014 07:00 - 08:00 | 0 | 0 | 0 | 0 |
| 19.04.2014 08:00 - 09:00 | 0 | 0 | 0 | 0 |
| 19.04.2014 09:00 - 10:00 | 0 | 0 | 0 | 0 |
| 19.04.2014 10:00 - 11:00 | 0 | 0 | 0 | 0 |
| 19.04.2014 11:00 - 12:00 | 0 | 0 | 0 | 0 |
| 19.04.2014 12:00 - 13:00 | 0 | 0 | 0 | 0 |
| 19.04.2014 13:00 - 14:00 | 0 | 0 | 0 | 0 |
| 19.04.2014 14:00 - 15:00 | 0 | 0 | 0 | 0 |
| 19.04.2014 15:00 - 16:00 | 0 | 0 | 0 | 0 |
| 19.04.2014 16:00 - 17:00 | 0 | -300 | 0 | 0 |
| 19.04.2014 17:00 - 18:00 | 0 | -300 | 0 | 0 |
| 19.04.2014 18:00 - 19:00 | 0 | -600 | 0 | 0 |
| 19.04.2014 19:00 - 20:00 | 0 | -600 | 0 | 0 |
| 19.04.2014 20:00 - 21:00 | 0 | -600 | 0 | 0 |
| 19.04.2014 21:00 - 22:00 | 0 | -600 | 0 | 0 |
| 19.04.2014 22:00 - 23:00 | 0 | -600 | 0 | 0 |
| 19.04.2014 23:00 - 24:00 | 0 | -600 | 0 | 0 |
| 20.04.2014 00:00 - 01:00 | 0 | -600 | 0 | 0 |
| 20.04.2014 01:00 - 02:00 | 0 | -600 | 0 | 0 |
| 20.04.2014 02:00 - 03:00 | 0 | -600 | 0 | 0 |
| 20.04.2014 03:00 - 04:00 | 0 | -600 | 0 | 0 |
| 20.04.2014 04:00 - 05:00 | 0 | -600 | 0 | 0 |
| 20.04.2014 05:00 - 06:00 | 0 | -600 | 0 | 0 |
| 20.04.2014 06:00 - 07:00 | 0 | 0 | 0 | 0 |
| 20.04.2014 07:00 - 08:00 | 0 | 0 | 0 | 0 |
| 20.04.2014 08:00 - 09:00 | 0 | 0 | 0 | 0 |
| 20.04.2014 09:00 - 10:00 | 0 | 0 | 0 | 0 |
| 20.04.2014 10:00 - 11:00 | 0 | 0 | 0 | 0 |
| 20.04.2014 11:00 - 12:00 | 0 | 0 | 0 | 0 |
| 20.04.2014 12:00 - 13:00 | 0 | 0 | 0 | 0 |
| 20.04.2014 13:00 - 14:00 | 0 | 0 | 0 | 0 |
| 20.04.2014 14:00 - 15:00 | 0 | 0 | 0 | 0 |
| 20.04.2014 15:00 - 16:00 | 0 | 0 | 0 | 0 |
| 20.04.2014 16:00 - 17:00 | 0 | 0 | 0 | 0 |
| 20.04.2014 17:00 - 18:00 | 0 | 0 | 0 | 0 |
| 20.04.2014 18:00 - 19:00 | 0 | 0 | 0 | 0 |
| 20.04.2014 19:00 - 20:00 | 0 | 0 | 0 | 0 |
| 20.04.2014 20:00 - 21:00 | 0 | 0 | 0 | 0 |
| 20.04.2014 21:00 - 22:00 | 0 | 0 | 0 | 0 |
| 20.04.2014 22:00 - 23:00 | 0 | 0 | 0 | 0 |
| 20.04.2014 23:00 - 24:00 | 0 | 0 | 0 | 0 |
| 21.04.2014 00:00 - 01:00 | 0 | 0 | 0 | 0 |
| 21.04.2014 01:00 - 02:00 | 0 | 0 | 0 | 0 |
| 21.04.2014 02:00 - 03:00 | 0 | 0 | 0 | 0 |
| 21.04.2014 03:00 - 04:00 | 0 | 0 | 0 | 0 |
| 21.04.2014 04:00 - 05:00 | 0 | 0 | 0 | 0 |
| 21.04.2014 05:00 - 06:00 | 0 | 0 | 0 | 0 |
| 21.04.2014 06:00 - 07:00 | 0 | 0 | 0 | 0 |
| 21.04.2014 07:00 - 08:00 | 0 | 0 | 0 | 0 |
| 21.04.2014 08:00 - 09:00 | 0 | 0 | 0 | 0 |
| 21.04.2014 09:00 - 10:00 | 0 | 0 | 0 | 0 |
| 21.04.2014 10:00 - 11:00 | 0 | 0 | 0 | 0 |
| 21.04.2014 11:00 - 12:00 | 0 | 0 | 0 | 0 |
| 21.04.2014 12:00 - 13:00 | 0 | 0 | 0 | 0 |
| 21.04.2014 13:00 - 14:00 | 0 | 0 | 0 | 0 |
| 21.04.2014 14:00 - 15:00 | 0 | 0 | 0 | 0 |
| 21.04.2014 15:00 - 16:00 | 0 | 0 | 0 | 0 |
| 21.04.2014 16:00 - 17:00 | 0 | 0 | 0 | 0 |
| 21.04.2014 17:00 - 18:00 | 0 | 0 | 0 | 0 |
| 21.04.2014 18:00 - 19:00 | 0 | 0 | 0 | 0 |
| 21.04.2014 19:00 - 20:00 | 0 | 0 | 0 | 0 |
| 21.04.2014 20:00 - 21:00 | 0 | 0 | 0 | 0 |
| 21.04.2014 21:00 - 22:00 | 0 | -300 | 0 | 0 |
| 21.04.2014 22:00 - 23:00 | 0 | -300 | 0 | 0 |
| 21.04.2014 23:00 - 24:00 | 0 | -300 | 0 | 0 |
| 22.04.2014 00:00 - 01:00 | 0 | -300 | 0 | 0 |
| 22.04.2014 01:00 - 02:00 | 0 | -300 | 0 | 0 |
| 22.04.2014 02:00 - 03:00 | 0 | -300 | 0 | 0 |
| 22.04.2014 03:00 - 04:00 | 0 | -300 | 0 | 0 |
| 22.04.2014 04:00 - 05:00 | 0 | -300 | 0 | 0 |
| 22.04.2014 05:00 - 06:00 | 0 | -300 | 0 | 0 |
| 22.04.2014 06:00 - 07:00 | 0 | 0 | 0 | 0 |
| 22.04.2014 07:00 - 08:00 | 0 | 0 | 0 | 0 |
| 22.04.2014 08:00 - 09:00 | 0 | 0 | 0 | 0 |
| 22.04.2014 09:00 - 10:00 | 0 | 0 | 0 | 0 |
| 22.04.2014 10:00 - 11:00 | 0 | 0 | 0 | 0 |
| 22.04.2014 11:00 - 12:00 | 0 | 0 | 0 | 0 |
| 22.04.2014 12:00 - 13:00 | 0 | 0 | 0 | 0 |
| 22.04.2014 13:00 - 14:00 | 0 | 0 | 0 | 0 |
| 22.04.2014 14:00 - 15:00 | 0 | 0 | 0 | 0 |
| 22.04.2014 15:00 - 16:00 | 0 | 0 | 0 | 0 |
| 22.04.2014 16:00 - 17:00 | 0 | 0 | 0 | 0 |
| 22.04.2014 17:00 - 18:00 | 0 | 0 | 0 | 0 |
| 22.04.2014 18:00 - 19:00 | 0 | 0 | 0 | 0 |
| 22.04.2014 19:00 - 20:00 | 0 | 0 | 0 | 0 |
| 22.04.2014 20:00 - 21:00 | 0 | 0 | 0 | 0 |
| 22.04.2014 21:00 - 22:00 | 0 | 0 | 0 | 0 |
| 22.04.2014 22:00 - 23:00 | 0 | 0 | 0 | 0 |
| 22.04.2014 23:00 - 24:00 | 0 | 0 | 0 | 0 |
| 23.04.2014 00:00 - 01:00 | 0 | 0 | 0 | 0 |
| 23.04.2014 01:00 - 02:00 | 0 | 0 | 0 | 0 |
| 23.04.2014 02:00 - 03:00 | 0 | 0 | 0 | 0 |
| 23.04.2014 03:00 - 04:00 | 0 | 0 | 0 | 0 |
| 23.04.2014 04:00 - 05:00 | 0 | 0 | 0 | 0 |
| 23.04.2014 05:00 - 06:00 | 0 | 0 | 0 | 0 |
| 23.04.2014 06:00 - 07:00 | 0 | 0 | 0 | 0 |
| 23.04.2014 07:00 - 08:00 | 0 | 0 | 0 | 0 |
| 23.04.2014 08:00 - 09:00 | 0 | 0 | 0 | 0 |
| 23.04.2014 09:00 - 10:00 | 0 | 0 | 0 | 0 |
| 23.04.2014 10:00 - 11:00 | 0 | 0 | 0 | 0 |
| 23.04.2014 11:00 - 12:00 | 0 | 0 | 0 | 0 |
| 23.04.2014 12:00 - 13:00 | 0 | 0 | 0 | 0 |
| 23.04.2014 13:00 - 14:00 | 0 | 0 | 0 | 0 |
| 23.04.2014 14:00 - 15:00 | 0 | 0 | 0 | 0 |
| 23.04.2014 15:00 - 16:00 | 0 | 0 | 0 | 0 |
| 23.04.2014 16:00 - 17:00 | 0 | 0 | 0 | 0 |
| 23.04.2014 17:00 - 18:00 | 0 | 0 | 0 | 0 |
| 23.04.2014 18:00 - 19:00 | 0 | 0 | 0 | 0 |
| 23.04.2014 19:00 - 20:00 | 0 | 0 | 0 | 0 |
| 23.04.2014 20:00 - 21:00 | 0 | 0 | 0 | 0 |
| 23.04.2014 21:00 - 22:00 | 0 | 0 | 0 | 0 |
| 23.04.2014 22:00 - 23:00 | 0 | 0 | 0 | 0 |
| 23.04.2014 23:00 - 24:00 | 0 | 0 | 0 | 0 |
| 24.04.2014 00:00 - 01:00 | 0 | 0 | 0 | 0 |
| 24.04.2014 01:00 - 02:00 | 0 | 0 | 0 | 0 |
| 24.04.2014 02:00 - 03:00 | 0 | 0 | 0 | 0 |
| 24.04.2014 03:00 - 04:00 | 0 | 0 | 0 | 0 |
| 24.04.2014 04:00 - 05:00 | 0 | 0 | 0 | 0 |
| 24.04.2014 05:00 - 06:00 | 0 | 0 | 0 | 0 |
| 24.04.2014 06:00 - 07:00 | 0 | 0 | 0 | 0 |
| 24.04.2014 07:00 - 08:00 | 0 | 0 | 0 | 0 |
| 24.04.2014 08:00 - 09:00 | 0 | 0 | 0 | 0 |
| 24.04.2014 09:00 - 10:00 | 0 | 0 | 0 | 0 |
| 24.04.2014 10:00 - 11:00 | 0 | 0 | 0 | 0 |
| 24.04.2014 11:00 - 12:00 | 0 | 0 | 0 | 0 |
| 24.04.2014 12:00 - 13:00 | 0 | 0 | 0 | 0 |
| 24.04.2014 13:00 - 14:00 | 0 | 0 | 0 | 0 |
| 24.04.2014 14:00 - 15:00 | 0 | 0 | 0 | 0 |
| 24.04.2014 15:00 - 16:00 | 0 | 0 | 0 | 0 |
| 24.04.2014 16:00 - 17:00 | 0 | 0 | 0 | 0 |
| 24.04.2014 17:00 - 18:00 | 0 | 0 | 0 | 0 |
| 24.04.2014 18:00 - 19:00 | 0 | 0 | 0 | 0 |
| 24.04.2014 19:00 - 20:00 | 0 | 0 | 0 | 0 |
| 24.04.2014 20:00 - 21:00 | 0 | 0 | 0 | 0 |
| 24.04.2014 21:00 - 22:00 | 0 | 0 | 0 | 0 |
| 24.04.2014 22:00 - 23:00 | 0 | 0 | 0 | 0 |
| 24.04.2014 23:00 - 24:00 | 0 | 0 | 0 | 0 |
| 25.04.2014 00:00 - 01:00 | 0 | 0 | 0 | 0 |
| 25.04.2014 01:00 - 02:00 | 0 | 0 | 0 | 0 |
| 25.04.2014 02:00 - 03:00 | 0 | 0 | 0 | 0 |
| 25.04.2014 03:00 - 04:00 | 0 | 0 | 0 | 0 |
| 25.04.2014 04:00 - 05:00 | 0 | 0 | 0 | 0 |
| 25.04.2014 05:00 - 06:00 | 0 | 0 | 0 | 0 |
| 25.04.2014 06:00 - 07:00 | 0 | 0 | 0 | 0 |
| 25.04.2014 07:00 - 08:00 | 0 | 0 | 0 | 0 |
| 25.04.2014 08:00 - 09:00 | 0 | 0 | 0 | 0 |
| 25.04.2014 09:00 - 10:00 | 0 | 0 | 0 | 0 |
| 25.04.2014 10:00 - 11:00 | 0 | 0 | 0 | 0 |
| 25.04.2014 11:00 - 12:00 | 0 | 0 | 0 | 0 |
| 25.04.2014 12:00 - 13:00 | 0 | 0 | 0 | 0 |
| 25.04.2014 13:00 - 14:00 | 0 | 0 | 0 | 0 |
| 25.04.2014 14:00 - 15:00 | 0 | 0 | 0 | 0 |
| 25.04.2014 15:00 - 16:00 | 0 | 0 | 0 | 0 |
| 25.04.2014 16:00 - 17:00 | 0 | 0 | 0 | 0 |
| 25.04.2014 17:00 - 18:00 | 0 | 0 | 0 | 0 |
| 25.04.2014 18:00 - 19:00 | 0 | 0 | 0 | 0 |
| 25.04.2014 19:00 - 20:00 | 0 | 0 | 0 | 0 |
| 25.04.2014 20:00 - 21:00 | 0 | 0 | 0 | 0 |
| 25.04.2014 21:00 - 22:00 | 0 | 0 | 0 | 0 |
| 25.04.2014 22:00 - 23:00 | 0 | 0 | 0 | 0 |
| 25.04.2014 23:00 - 24:00 | 0 | 0 | 0 | 0 |
| 26.04.2014 00:00 - 01:00 | 0 | 0 | 0 | 0 |
| 26.04.2014 01:00 - 02:00 | 0 | 0 | 0 | 0 |
| 26.04.2014 02:00 - 03:00 | 0 | 0 | 0 | 0 |
| 26.04.2014 03:00 - 04:00 | 0 | 0 | 0 | 0 |
| 26.04.2014 04:00 - 05:00 | 0 | 0 | 0 | 0 |
| 26.04.2014 05:00 - 06:00 | 0 | 0 | 0 | 0 |
| 26.04.2014 06:00 - 07:00 | 0 | 0 | 0 | 0 |
| 26.04.2014 07:00 - 08:00 | 0 | 0 | 0 | 0 |
| 26.04.2014 08:00 - 09:00 | 0 | 0 | 0 | 0 |
| 26.04.2014 09:00 - 10:00 | 0 | 0 | 0 | 0 |
| 26.04.2014 10:00 - 11:00 | 0 | 0 | 0 | 0 |
| 26.04.2014 11:00 - 12:00 | 0 | 0 | 0 | 0 |
| 26.04.2014 12:00 - 13:00 | 0 | 0 | 0 | 0 |
| 26.04.2014 13:00 - 14:00 | 0 | 0 | 0 | 0 |
| 26.04.2014 14:00 - 15:00 | 500 | 0 | 0 | 0 |
| 26.04.2014 15:00 - 16:00 | 500 | 0 | 0 | 0 |
| 26.04.2014 16:00 - 17:00 | 500 | 0 | 0 | 0 |
| 26.04.2014 17:00 - 18:00 | 500 | 0 | 0 | 0 |
| 26.04.2014 18:00 - 19:00 | 500 | 0 | 0 | 0 |
| 26.04.2014 19:00 - 20:00 | 500 | 0 | 0 | 0 |
| 26.04.2014 20:00 - 21:00 | 500 | 0 | 0 | 0 |
| 26.04.2014 21:00 - 22:00 | 500 | 0 | 0 | 0 |
| 26.04.2014 22:00 - 23:00 | 500 | 0 | 0 | 0 |
| 26.04.2014 23:00 - 24:00 | 500 | 0 | 0 | 0 |
| 27.04.2014 00:00 - 01:00 | 500 | 0 | 0 | 0 |
| 27.04.2014 01:00 - 02:00 | 500 | 0 | 0 | 0 |
| 27.04.2014 02:00 - 03:00 | 500 | 0 | 0 | 0 |
| 27.04.2014 03:00 - 04:00 | 500 | 0 | 0 | 0 |
| 27.04.2014 04:00 - 05:00 | 500 | 0 | 0 | 0 |
| 27.04.2014 05:00 - 06:00 | 500 | 0 | 0 | 0 |
| 27.04.2014 06:00 - 07:00 | 0 | 0 | 0 | 0 |
| 27.04.2014 07:00 - 08:00 | 0 | 0 | 0 | 0 |
| 27.04.2014 08:00 - 09:00 | 0 | 0 | 0 | 0 |
| 27.04.2014 09:00 - 10:00 | 0 | 0 | 0 | 0 |
| 27.04.2014 10:00 - 11:00 | 0 | 0 | 0 | 0 |
| 27.04.2014 11:00 - 12:00 | 0 | 0 | 0 | 0 |
| 27.04.2014 12:00 - 13:00 | 400 | 0 | 0 | 0 |
| 27.04.2014 13:00 - 14:00 | 400 | 0 | 0 | 0 |
| 27.04.2014 14:00 - 15:00 | 400 | 0 | 0 | 0 |
| 27.04.2014 15:00 - 16:00 | 400 | 0 | 0 | 0 |
| 27.04.2014 16:00 - 17:00 | 400 | 0 | 0 | 0 |
| 27.04.2014 17:00 - 18:00 | 400 | 0 | 0 | 0 |
| 27.04.2014 18:00 - 19:00 | 400 | 0 | 0 | 0 |
| 27.04.2014 19:00 - 20:00 | 400 | 0 | 0 | 0 |
| 27.04.2014 20:00 - 21:00 | 400 | 0 | 0 | 0 |
| 27.04.2014 21:00 - 22:00 | 400 | 0 | 0 | 0 |
| 27.04.2014 22:00 - 23:00 | 400 | 0 | 0 | 0 |
| 27.04.2014 23:00 - 24:00 | 400 | 0 | 0 | 0 |
| 28.04.2014 00:00 - 01:00 | 720 | 0 | 0 | 0 |
| 28.04.2014 01:00 - 02:00 | 720 | 0 | 0 | 0 |
| 28.04.2014 02:00 - 03:00 | 720 | 0 | 0 | 0 |
| 28.04.2014 03:00 - 04:00 | 720 | 0 | 0 | 0 |
| 28.04.2014 04:00 - 05:00 | 720 | 0 | 0 | 0 |
| 28.04.2014 05:00 - 06:00 | 720 | 0 | 0 | 0 |
| 28.04.2014 06:00 - 07:00 | 0 | 0 | 0 | 0 |
| 28.04.2014 07:00 - 08:00 | 0 | 0 | 0 | 0 |
| 28.04.2014 08:00 - 09:00 | 0 | 0 | 0 | 0 |
| 28.04.2014 09:00 - 10:00 | 0 | 0 | 0 | 0 |
| 28.04.2014 10:00 - 11:00 | 0 | 0 | 0 | 0 |
| 28.04.2014 11:00 - 12:00 | 0 | 0 | 0 | 0 |
| 28.04.2014 12:00 - 13:00 | 300 | 0 | 0 | 0 |
| 28.04.2014 13:00 - 14:00 | 300 | 0 | 0 | 0 |
| 28.04.2014 14:00 - 15:00 | 300 | 0 | 0 | 0 |
| 28.04.2014 15:00 - 16:00 | 300 | 0 | 0 | 0 |
| 28.04.2014 16:00 - 17:00 | 300 | 0 | 0 | 0 |
| 28.04.2014 17:00 - 18:00 | 300 | 0 | 0 | 0 |
| 28.04.2014 18:00 - 19:00 | 300 | 0 | 0 | 0 |
| 28.04.2014 19:00 - 20:00 | 300 | 0 | 0 | 0 |
| 28.04.2014 20:00 - 21:00 | 300 | 0 | 0 | 0 |
| 28.04.2014 21:00 - 22:00 | 300 | 0 | 0 | 0 |
| 28.04.2014 22:00 - 23:00 | 300 | 0 | 0 | 0 |
| 28.04.2014 23:00 - 24:00 | 300 | 0 | 0 | 0 |
| 29.04.2014 00:00 - 01:00 | 300 | 0 | 0 | 0 |
| 29.04.2014 01:00 - 02:00 | 300 | 0 | 0 | 0 |
| 29.04.2014 02:00 - 03:00 | 300 | 0 | 0 | 0 |
| 29.04.2014 03:00 - 04:00 | 300 | 0 | 0 | 0 |
| 29.04.2014 04:00 - 05:00 | 300 | 0 | 0 | 0 |
| 29.04.2014 05:00 - 06:00 | 300 | 0 | 0 | 0 |
| 29.04.2014 06:00 - 07:00 | 0 | 0 | 0 | 0 |
| 29.04.2014 07:00 - 08:00 | 0 | 0 | 0 | 0 |
| 29.04.2014 08:00 - 09:00 | 0 | 0 | 0 | 0 |
| 29.04.2014 09:00 - 10:00 | 0 | 0 | 0 | 0 |
| 29.04.2014 10:00 - 11:00 | 0 | 0 | 0 | 0 |
| 29.04.2014 11:00 - 12:00 | 0 | 0 | 0 | 0 |
| 29.04.2014 12:00 - 13:00 | 0 | 0 | 0 | 0 |
| 29.04.2014 13:00 - 14:00 | 0 | 0 | 0 | 0 |
| 29.04.2014 14:00 - 15:00 | 0 | 0 | 0 | 0 |
| 29.04.2014 15:00 - 16:00 | 0 | 0 | 0 | 0 |
| 29.04.2014 16:00 - 17:00 | 0 | 0 | 0 | 0 |
| 29.04.2014 17:00 - 18:00 | 0 | 0 | 0 | 0 |
| 29.04.2014 18:00 - 19:00 | 0 | 0 | 0 | 0 |
| 29.04.2014 19:00 - 20:00 | 0 | 0 | 0 | 0 |
| 29.04.2014 20:00 - 21:00 | 0 | 0 | 0 | 0 |
| 29.04.2014 21:00 - 22:00 | 0 | 0 | 0 | 0 |
| 29.04.2014 22:00 - 23:00 | 0 | 0 | 0 | 0 |
| 29.04.2014 23:00 - 24:00 | 0 | 0 | 0 | 0 |
| 30.04.2014 00:00 - 01:00 | 0 | 0 | 0 | 0 |
| 30.04.2014 01:00 - 02:00 | 0 | 0 | 0 | 0 |
| 30.04.2014 02:00 - 03:00 | 0 | 0 | 0 | 0 |
| 30.04.2014 03:00 - 04:00 | 0 | 0 | 0 | 0 |
| 30.04.2014 04:00 - 05:00 | 0 | 0 | 0 | 0 |
| 30.04.2014 05:00 - 06:00 | 0 | 0 | 0 | 0 |
| 30.04.2014 06:00 - 07:00 | 0 | 0 | 0 | 0 |
| 30.04.2014 07:00 - 08:00 | 0 | 0 | 0 | 0 |
| 30.04.2014 08:00 - 09:00 | 0 | 0 | 0 | 0 |
| 30.04.2014 09:00 - 10:00 | 0 | 0 | 0 | 0 |
| 30.04.2014 10:00 - 11:00 | 0 | 0 | 0 | 0 |
| 30.04.2014 11:00 - 12:00 | 0 | 0 | 0 | 0 |
| 30.04.2014 12:00 - 13:00 | 0 | 0 | 0 | 0 |
| 30.04.2014 13:00 - 14:00 | 0 | 0 | 0 | 0 |
| 30.04.2014 14:00 - 15:00 | 0 | 0 | 0 | 0 |
| 30.04.2014 15:00 - 16:00 | 0 | 0 | 0 | 0 |
| 30.04.2014 16:00 - 17:00 | 0 | 0 | 0 | 0 |
| 30.04.2014 17:00 - 18:00 | 0 | 0 | 0 | 0 |
| 30.04.2014 18:00 - 19:00 | 0 | 0 | 0 | 0 |
| 30.04.2014 19:00 - 20:00 | 0 | 0 | 0 | 0 |
| 30.04.2014 20:00 - 21:00 | 0 | 0 | 0 | 0 |
| 30.04.2014 21:00 - 22:00 | 0 | 0 | 0 | 0 |
| 30.04.2014 22:00 - 23:00 | 0 | 0 | 0 | 0 |
| 30.04.2014 23:00 - 24:00 | 0 | -412 | 0 | 0 |
| 01.05.2014 00:00 - 01:00 | 0 | -412 | 0 | 0 |
| 01.05.2014 01:00 - 02:00 | 0 | -712 | 0 | 0 |
| 01.05.2014 02:00 - 03:00 | 0 | -1012 | 0 | 0 |
| 01.05.2014 03:00 - 04:00 | 0 | -1012 | 0 | 0 |
| 01.05.2014 04:00 - 05:00 | 0 | -1012 | 0 | 0 |
| 01.05.2014 05:00 - 06:00 | 0 | -1012 | 0 | 0 |